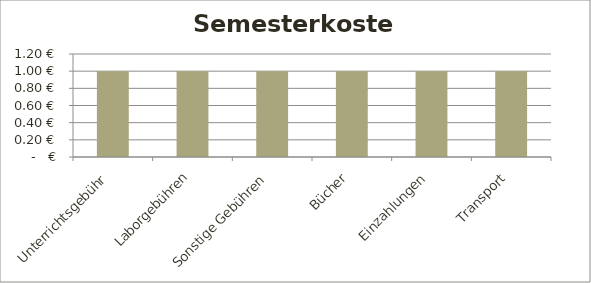
| Category | Betrag |
|---|---|
| Unterrichtsgebühr | 1 |
| Laborgebühren | 1 |
| Sonstige Gebühren | 1 |
| Bücher | 1 |
| Einzahlungen | 1 |
| Transport | 1 |